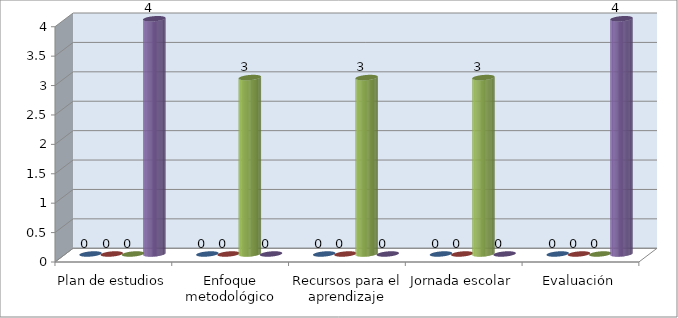
| Category | Series 0 | Series 1 | Series 2 | Series 3 |
|---|---|---|---|---|
| Plan de estudios | 0 | 0 | 0 | 4 |
| Enfoque metodológico | 0 | 0 | 3 | 0 |
| Recursos para el aprendizaje | 0 | 0 | 3 | 0 |
| Jornada escolar | 0 | 0 | 3 | 0 |
| Evaluación | 0 | 0 | 0 | 4 |